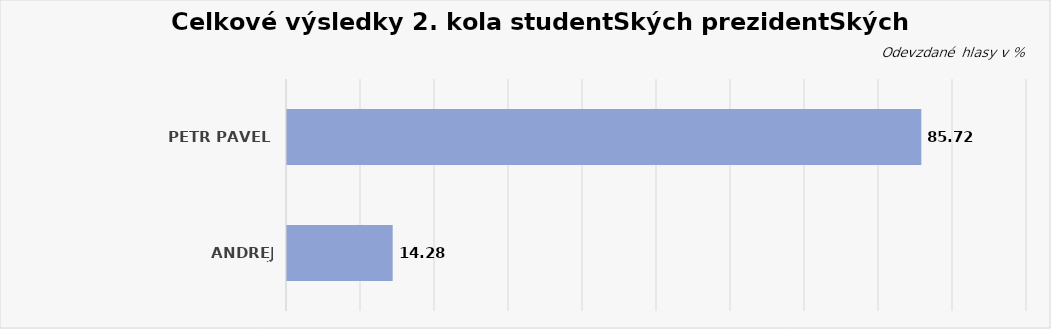
| Category | Series 1 |
|---|---|
| Petr Pavel | 85.719 |
| Andrej Babiš | 14.281 |